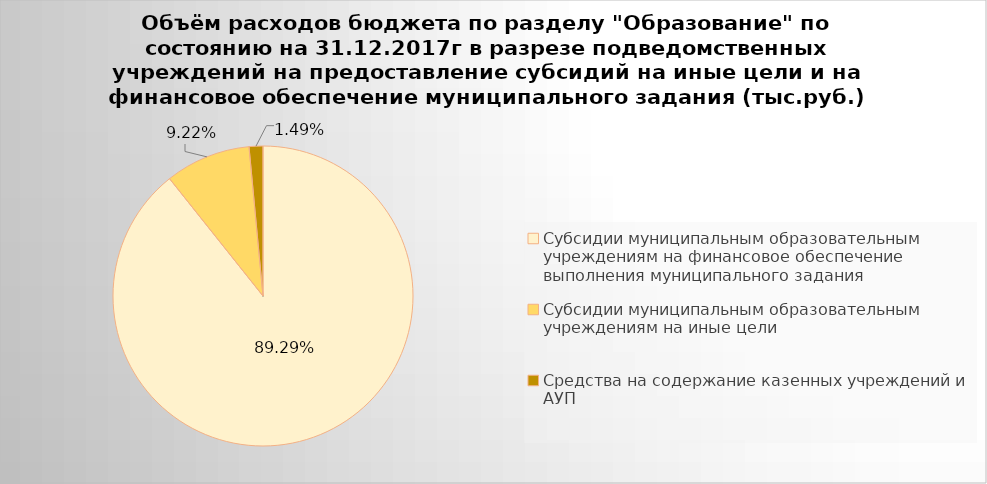
| Category | Series 0 |
|---|---|
| Субсидии муниципальным образовательным учреждениям на финансовое обеспечение выполнения муниципального задания | 5044464.27 |
| Субсидии муниципальным образовательным учреждениям на иные цели | 520759.05 |
| Средства на содержание казенных учреждений и АУП | 84068.7 |